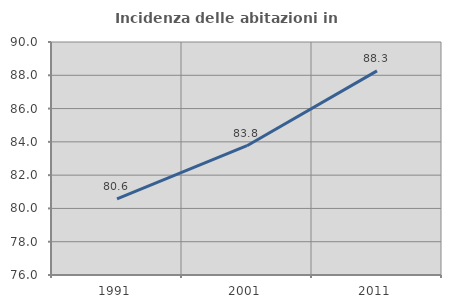
| Category | Incidenza delle abitazioni in proprietà  |
|---|---|
| 1991.0 | 80.569 |
| 2001.0 | 83.77 |
| 2011.0 | 88.265 |